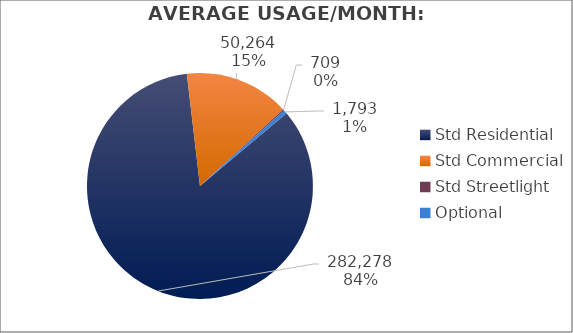
| Category | Usage |
|---|---|
| Std Residential | 282278.333 |
| Std Commercial | 50264.333 |
| Std Streetlight | 709 |
| Optional | 1793 |